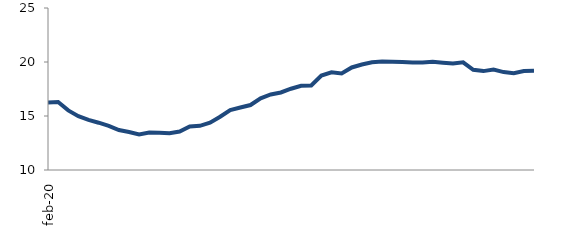
| Category | Series 0 |
|---|---|
| 2020-02-01 | 16.25 |
| 2020-03-01 | 16.293 |
| 2020-04-01 | 15.517 |
| 2020-05-01 | 14.987 |
| 2020-06-01 | 14.648 |
| 2020-07-01 | 14.379 |
| 2020-08-01 | 14.088 |
| 2020-09-01 | 13.698 |
| 2020-10-01 | 13.522 |
| 2020-11-01 | 13.294 |
| 2020-12-01 | 13.469 |
| 2021-01-01 | 13.453 |
| 2021-02-01 | 13.409 |
| 2021-03-01 | 13.556 |
| 2021-04-01 | 14.027 |
| 2021-05-01 | 14.092 |
| 2021-06-01 | 14.388 |
| 2021-07-01 | 14.927 |
| 2021-08-01 | 15.546 |
| 2021-09-01 | 15.791 |
| 2021-10-01 | 16.017 |
| 2021-11-01 | 16.641 |
| 2021-12-01 | 16.998 |
| 2022-01-01 | 17.179 |
| 2022-02-01 | 17.527 |
| 2022-03-01 | 17.804 |
| 2022-04-01 | 17.825 |
| 2022-05-01 | 18.751 |
| 2022-06-01 | 19.052 |
| 2022-07-01 | 18.945 |
| 2022-08-01 | 19.494 |
| 2022-09-01 | 19.767 |
| 2022-10-01 | 19.975 |
| 2022-11-01 | 20.037 |
| 2022-12-01 | 20.03 |
| 2023-01-01 | 19.993 |
| 2023-02-01 | 19.949 |
| 2023-03-01 | 19.953 |
| 2023-04-01 | 20.023 |
| 2023-05-01 | 19.94 |
| 2023-06-01 | 19.871 |
| 2023-07-01 | 19.969 |
| 2023-08-01 | 19.275 |
| 2023-09-01 | 19.157 |
| 2023-10-01 | 19.299 |
| 2023-11-01 | 19.065 |
| 2023-12-01 | 18.97 |
| 2024-01-01 | 19.172 |
| 2024-02-01 | 19.192 |